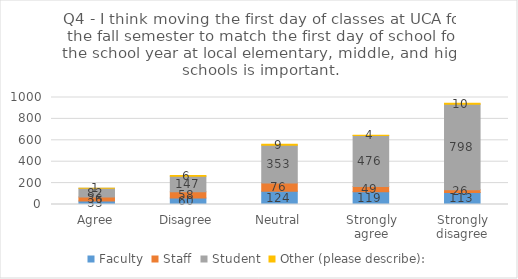
| Category | Faculty | Staff | Student | Other (please describe): |
|---|---|---|---|---|
| Agree | 33 | 36 | 82 | 1 |
| Disagree | 60 | 58 | 147 | 6 |
| Neutral | 124 | 76 | 353 | 9 |
| Strongly agree | 119 | 49 | 476 | 4 |
| Strongly disagree | 113 | 26 | 798 | 10 |